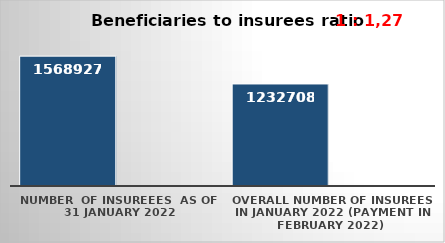
| Category | Series 0 | Series 1 |
|---|---|---|
| NUMBER  of insureees  as of  31 January 2022 | 1568927 |  |
| OVERALL number of insurees in January 2022 (payment in February 2022) | 1232708 |  |